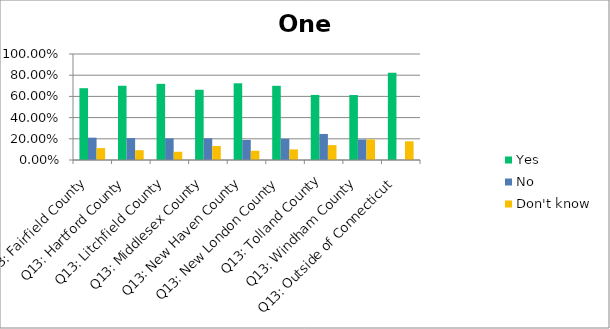
| Category | Yes | No | Don't know |
|---|---|---|---|
| Q13: Fairfield County | 0.677 | 0.211 | 0.112 |
| Q13: Hartford County | 0.701 | 0.207 | 0.092 |
| Q13: Litchfield County | 0.718 | 0.204 | 0.078 |
| Q13: Middlesex County | 0.663 | 0.205 | 0.132 |
| Q13: New Haven County | 0.724 | 0.189 | 0.087 |
| Q13: New London County | 0.7 | 0.2 | 0.1 |
| Q13: Tolland County | 0.614 | 0.246 | 0.14 |
| Q13: Windham County | 0.613 | 0.194 | 0.194 |
| Q13: Outside of Connecticut | 0.823 | 0 | 0.176 |